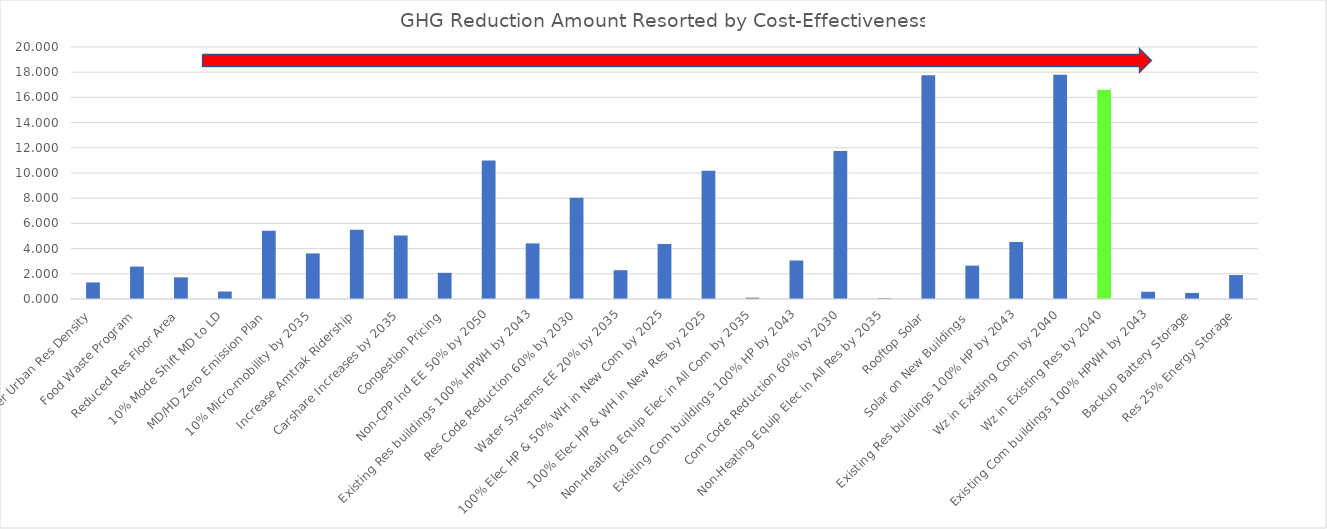
| Category | GHGE (MMTCO2) |
|---|---|
| Higher Urban Res Density | 1.315 |
| Food Waste Program | 2.572 |
| Reduced Res Floor Area | 1.718 |
| 10% Mode Shift MD to LD | 0.595 |
| MD/HD Zero Emission Plan | 5.419 |
| 10% Micro-mobility by 2035 | 3.615 |
| Increase Amtrak Ridership | 5.497 |
| Carshare Increases by 2035 | 5.042 |
| Congestion Pricing | 2.078 |
| Non-CPP Ind EE 50% by 2050 | 10.987 |
| Existing Res buildings 100% HPWH by 2043 | 4.414 |
| Res Code Reduction 60% by 2030 | 8.044 |
| Water Systems EE 20% by 2035 | 2.286 |
| 100% Elec HP & 50% WH in New Com by 2025 | 4.366 |
| 100% Elec HP & WH in New Res by 2025 | 10.182 |
| Non-Heating Equip Elec in All Com by 2035 | 0.103 |
| Existing Com buildings 100% HP by 2043 | 3.055 |
| Com Code Reduction 60% by 2030 | 11.751 |
| Non-Heating Equip Elec in All Res by 2035 | 0.055 |
| Rooftop Solar | 17.757 |
| Solar on New Buildings  | 2.648 |
| Existing Res buildings 100% HP by 2043 | 4.523 |
| Wz in Existing Com by 2040 | 17.791 |
| Wz in Existing Res by 2040 | 16.61 |
| Existing Com buildings 100% HPWH by 2043 | 0.572 |
| Backup Battery Storage | 0.482 |
| Res 25% Energy Storage | 1.9 |